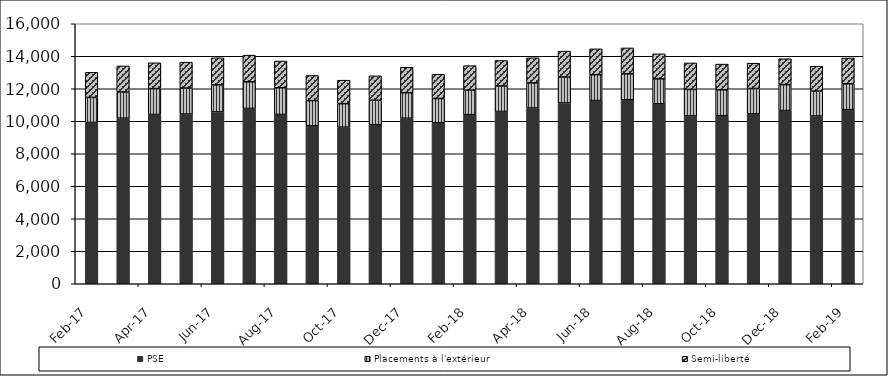
| Category | PSE | Placements à l'extérieur | Semi-liberté |
|---|---|---|---|
| 2017-02-01 | 9927 | 1542 | 1542 |
| 2017-03-01 | 10190 | 1607 | 1607 |
| 2017-04-01 | 10417 | 1590 | 1590 |
| 2017-05-01 | 10448 | 1594 | 1594 |
| 2017-06-01 | 10575 | 1664 | 1664 |
| 2017-07-01 | 10791 | 1639 | 1639 |
| 2017-08-01 | 10417 | 1644 | 1644 |
| 2017-09-01 | 9723 | 1547 | 1547 |
| 2017-10-01 | 9637 | 1445 | 1445 |
| 2017-11-01 | 9787 | 1504 | 1504 |
| 2017-12-01 | 10187 | 1568 | 1568 |
| 2018-01-01 | 9907 | 1493 | 1493 |
| 2018-02-01 | 10406 | 1508 | 1508 |
| 2018-03-01 | 10603 | 1569 | 1569 |
| 2018-04-01 | 10817 | 1544 | 1544 |
| 2018-05-01 | 11127 | 1594 | 1594 |
| 2018-06-01 | 11275 | 1591 | 1591 |
| 2018-07-01 | 11322 | 1596 | 1596 |
| 2018-08-01 | 11075 | 1537 | 1537 |
| 2018-09-01 | 10329 | 1630 | 1630 |
| 2018-10-01 | 10344 | 1587 | 1587 |
| 2018-11-01 | 10458 | 1557 | 1557 |
| 2018-12-01 | 10661 | 1593 | 1593 |
| 2019-01-01 | 10325 | 1530 | 1530 |
| 2019-02-01 | 10715 | 1589 | 1589 |